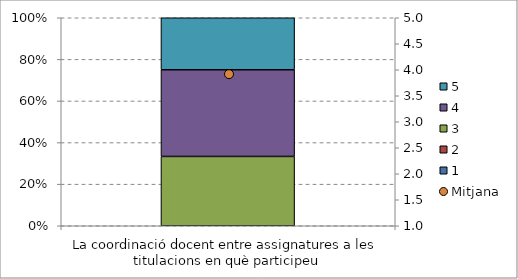
| Category | 1 | 2 | 3 | 4 | 5 |
|---|---|---|---|---|---|
| La coordinació docent entre assignatures a les titulacions en què participeu | 0 | 0 | 0.333 | 0.417 | 0.25 |